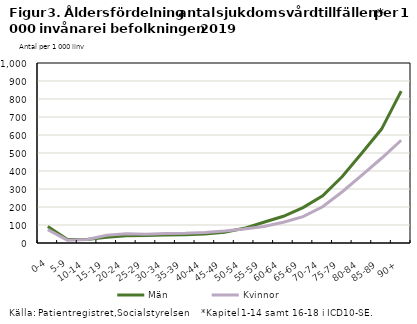
| Category | Män | Kvinnor |
|---|---|---|
| 0-4 | 91.727 | 74.063 |
| 5-9 | 19.583 | 15.701 |
| 10-14 | 18.807 | 19.231 |
| 15-19 | 31.342 | 43.127 |
| 20-24 | 40.904 | 50.868 |
| 25-29 | 41.142 | 49.019 |
| 30-34 | 43.861 | 52.794 |
| 35-39 | 45.596 | 54.074 |
| 40-44 | 49.683 | 58.274 |
| 45-49 | 59.866 | 66.185 |
| 50-54 | 81.428 | 77.361 |
| 55-59 | 114.984 | 92.035 |
| 60-64 | 148.524 | 115.463 |
| 65-69 | 196.592 | 146.845 |
| 70-74 | 262.341 | 201.218 |
| 75-79 | 369.01 | 284.911 |
| 80-84 | 500.101 | 376.671 |
| 85-89 | 632.94 | 470.788 |
| 90+ | 843.943 | 570.819 |